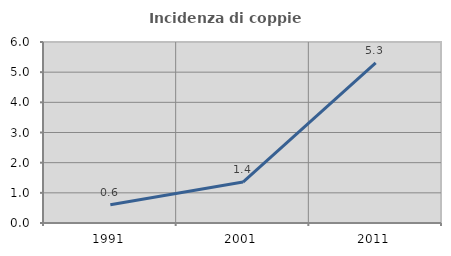
| Category | Incidenza di coppie miste |
|---|---|
| 1991.0 | 0.606 |
| 2001.0 | 1.356 |
| 2011.0 | 5.306 |